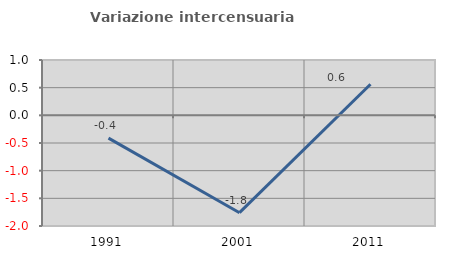
| Category | Variazione intercensuaria annua |
|---|---|
| 1991.0 | -0.412 |
| 2001.0 | -1.759 |
| 2011.0 | 0.561 |